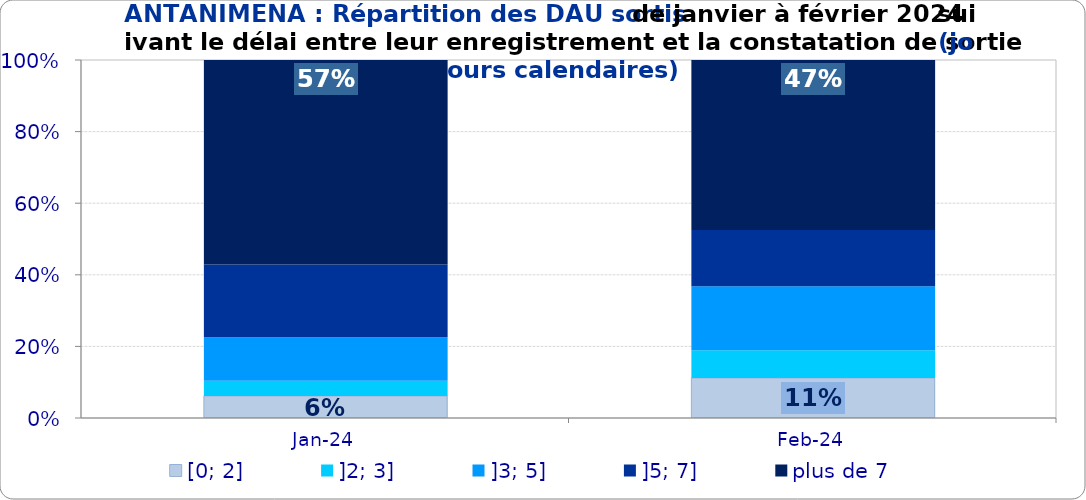
| Category | [0; 2] | ]2; 3] | ]3; 5] | ]5; 7] | plus de 7 |
|---|---|---|---|---|---|
| 2024-01-01 | 0.062 | 0.043 | 0.121 | 0.204 | 0.571 |
| 2024-02-01 | 0.112 | 0.077 | 0.179 | 0.157 | 0.475 |